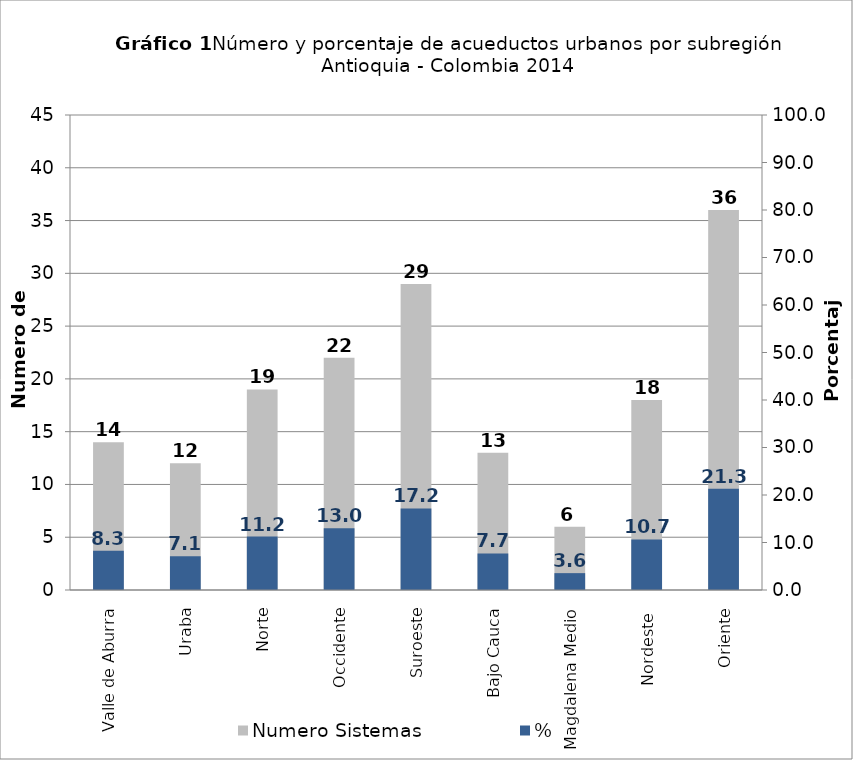
| Category | Numero Sistemas |
|---|---|
| Valle de Aburra | 14 |
| Uraba | 12 |
| Norte | 19 |
| Occidente | 22 |
| Suroeste | 29 |
| Bajo Cauca | 13 |
| Magdalena Medio | 6 |
| Nordeste  | 18 |
| Oriente | 36 |